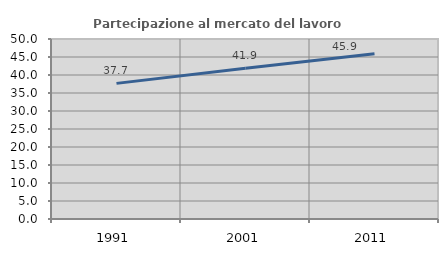
| Category | Partecipazione al mercato del lavoro  femminile |
|---|---|
| 1991.0 | 37.673 |
| 2001.0 | 41.86 |
| 2011.0 | 45.917 |